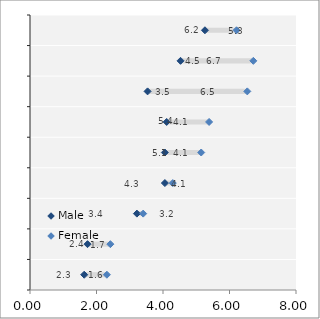
| Category | Hidden bar male | Difference |
|---|---|---|
| Lithuania | 1.63 | 0.682 |
| Latvia | 1.73 | 0.687 |
| Israel | 3.214 | 0.19 |
| Denmark | 4.057 | 0.238 |
| Sweden | 4.055 | 1.095 |
| Korea | 4.111 | 1.276 |
| New Zealand | 3.537 | 2.999 |
| Finland | 4.527 | 2.189 |
| Norway | 5.262 | 0.95 |